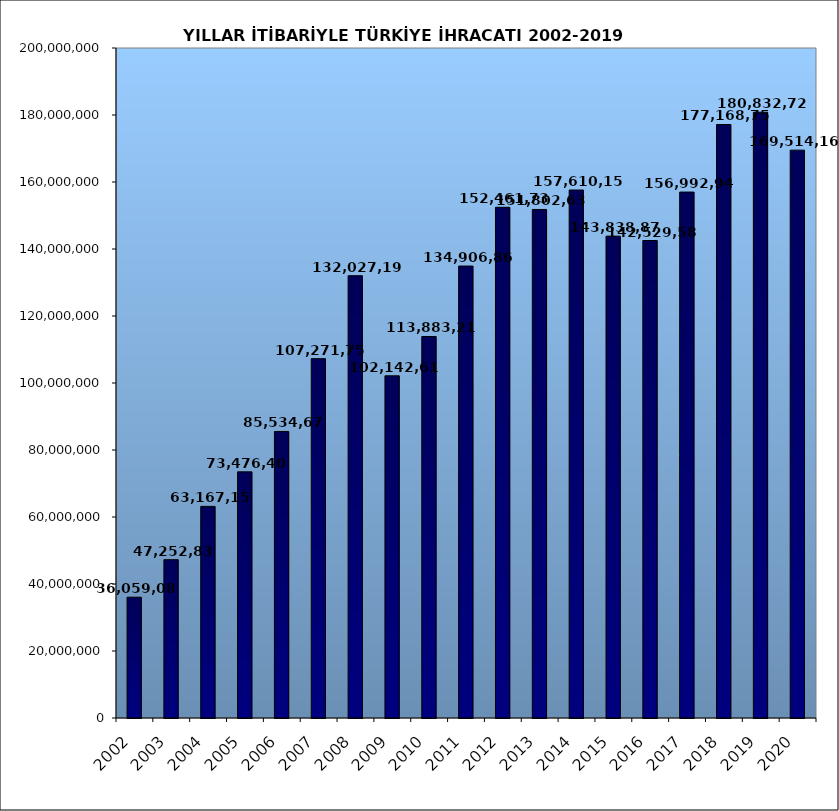
| Category | 2002 |
|---|---|
| 2002.0 | 36059089.029 |
| 2003.0 | 47252836.302 |
| 2004.0 | 63167152.82 |
| 2005.0 | 73476408.143 |
| 2006.0 | 85534675.518 |
| 2007.0 | 107271749.904 |
| 2008.0 | 132027195.626 |
| 2009.0 | 102142612.603 |
| 2010.0 | 113883219.184 |
| 2011.0 | 134906868.83 |
| 2012.0 | 152461736.556 |
| 2013.0 | 151802637.087 |
| 2014.0 | 157610157.69 |
| 2015.0 | 143838871.428 |
| 2016.0 | 142529583.808 |
| 2017.0 | 156992940.414 |
| 2018.0 | 177168756.288 |
| 2019.0 | 180832721.702 |
| 2020.0 | 169514167.033 |